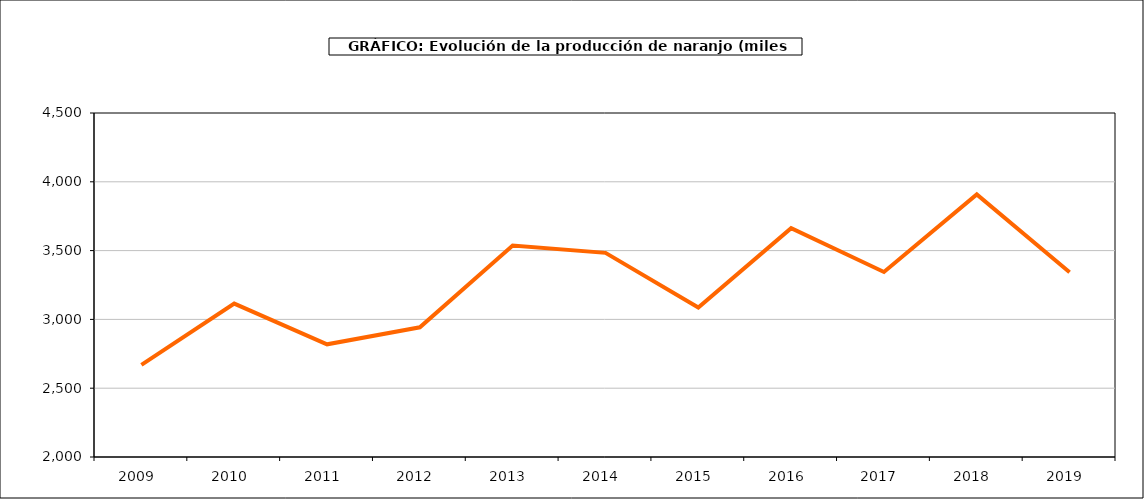
| Category | producción |
|---|---|
| 2009.0 | 2669.355 |
| 2010.0 | 3114.808 |
| 2011.0 | 2818.888 |
| 2012.0 | 2942.28 |
| 2013.0 | 3536.745 |
| 2014.0 | 3483.503 |
| 2015.0 | 3086.849 |
| 2016.0 | 3662.718 |
| 2017.0 | 3344.428 |
| 2018.0 | 3908.749 |
| 2019.0 | 3342.54 |